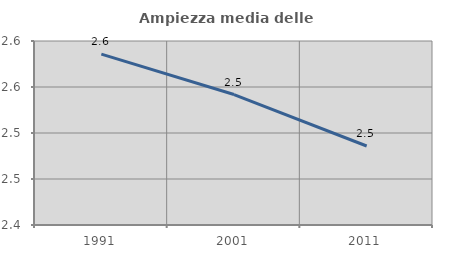
| Category | Ampiezza media delle famiglie |
|---|---|
| 1991.0 | 2.586 |
| 2001.0 | 2.542 |
| 2011.0 | 2.486 |